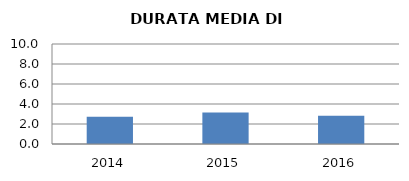
| Category | 2014 2015 2016 |
|---|---|
| 2014.0 | 2.731 |
| 2015.0 | 3.15 |
| 2016.0 | 2.815 |